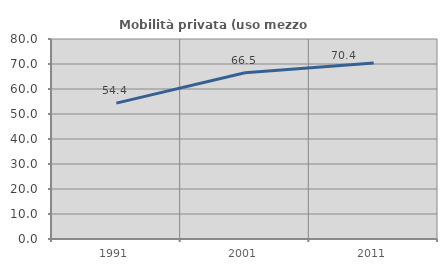
| Category | Mobilità privata (uso mezzo privato) |
|---|---|
| 1991.0 | 54.359 |
| 2001.0 | 66.5 |
| 2011.0 | 70.403 |